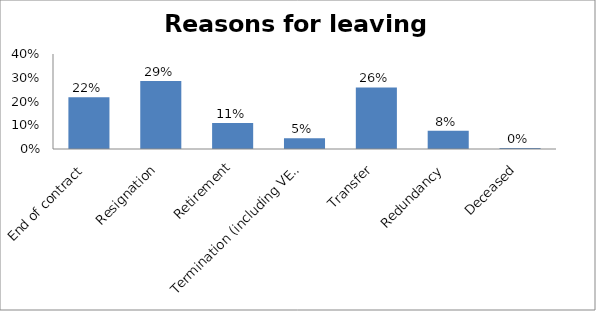
| Category | Series 0 |
|---|---|
| End of contract | 0.218 |
| Resignation | 0.286 |
| Retirement | 0.109 |
| Termination (including VES) | 0.045 |
| Transfer | 0.259 |
| Redundancy | 0.077 |
| Deceased | 0.005 |